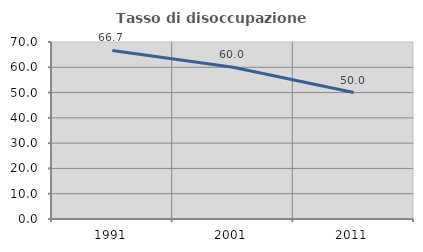
| Category | Tasso di disoccupazione giovanile  |
|---|---|
| 1991.0 | 66.667 |
| 2001.0 | 60 |
| 2011.0 | 50 |